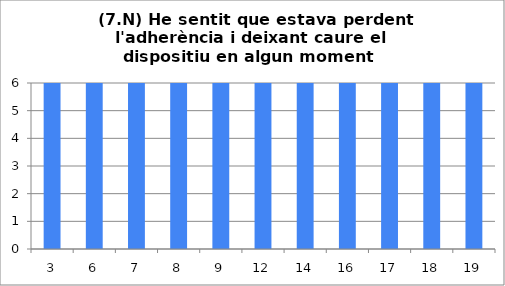
| Category | 7 |
|---|---|
| 3.0 | 6 |
| 6.0 | 6 |
| 7.0 | 6 |
| 8.0 | 6 |
| 9.0 | 6 |
| 12.0 | 6 |
| 14.0 | 6 |
| 16.0 | 6 |
| 17.0 | 6 |
| 18.0 | 6 |
| 19.0 | 6 |